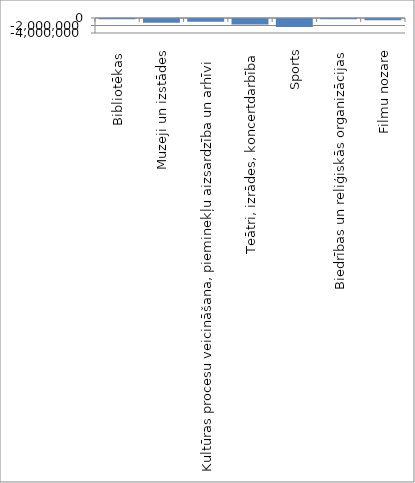
| Category | Series 0 |
|---|---|
|  Bibliotēkas  | -44372.39 |
| Muzeji un izstādes | -981267.155 |
| Kultūras procesu veicināšana, pieminekļu aizsardzība un arhīvi  | -704174.222 |
| Teātri, izrādes, koncertdarbība | -1485374.875 |
| Sports | -2114606.124 |
| Biedrības un reliģiskās organizācijas | -35260.219 |
| Filmu nozare | -313203 |